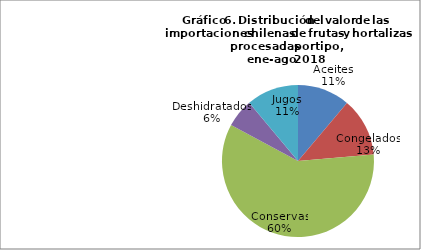
| Category | Series 0 |
|---|---|
| Aceites | 38534027.34 |
| Congelados | 43177206.46 |
| Conservas | 204767729.07 |
| Deshidratados | 20999685.3 |
| Jugos | 38349265.39 |